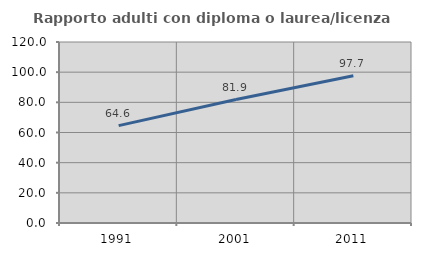
| Category | Rapporto adulti con diploma o laurea/licenza media  |
|---|---|
| 1991.0 | 64.563 |
| 2001.0 | 81.851 |
| 2011.0 | 97.677 |